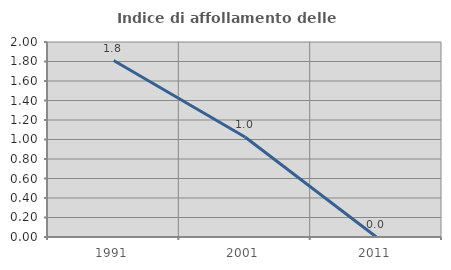
| Category | Indice di affollamento delle abitazioni  |
|---|---|
| 1991.0 | 1.81 |
| 2001.0 | 1.026 |
| 2011.0 | 0 |